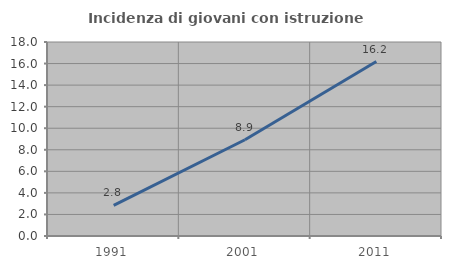
| Category | Incidenza di giovani con istruzione universitaria |
|---|---|
| 1991.0 | 2.847 |
| 2001.0 | 8.929 |
| 2011.0 | 16.19 |